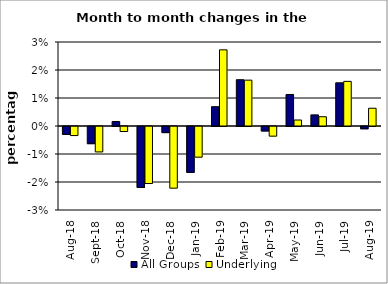
| Category | All Groups | Underlying |
|---|---|---|
| 2018-08-01 | -0.003 | -0.003 |
| 2018-09-01 | -0.006 | -0.009 |
| 2018-10-01 | 0.002 | -0.002 |
| 2018-11-01 | -0.022 | -0.02 |
| 2018-12-01 | -0.002 | -0.022 |
| 2019-01-01 | -0.016 | -0.011 |
| 2019-02-01 | 0.007 | 0.027 |
| 2019-03-01 | 0.017 | 0.016 |
| 2019-04-01 | -0.002 | -0.003 |
| 2019-05-01 | 0.011 | 0.002 |
| 2019-06-01 | 0.004 | 0.003 |
| 2019-07-01 | 0.015 | 0.016 |
| 2019-08-01 | -0.001 | 0.006 |